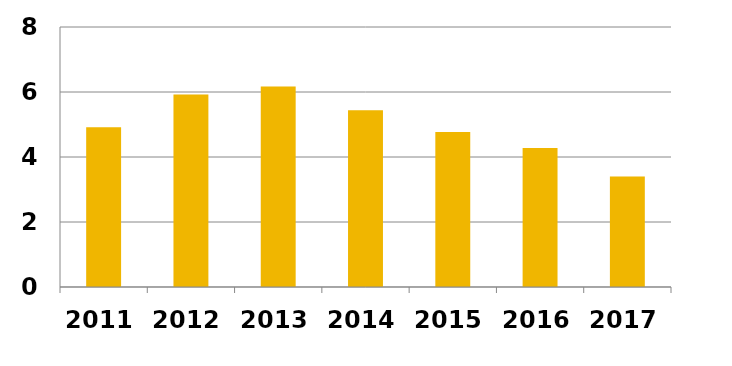
| Category | Ökad arbetslöshet 10 procent |
|---|---|
| 2011.0 | 4.912 |
| 2012.0 | 5.925 |
| 2013.0 | 6.166 |
| 2014.0 | 5.441 |
| 2015.0 | 4.772 |
| 2016.0 | 4.275 |
| 2017.0 | 3.4 |